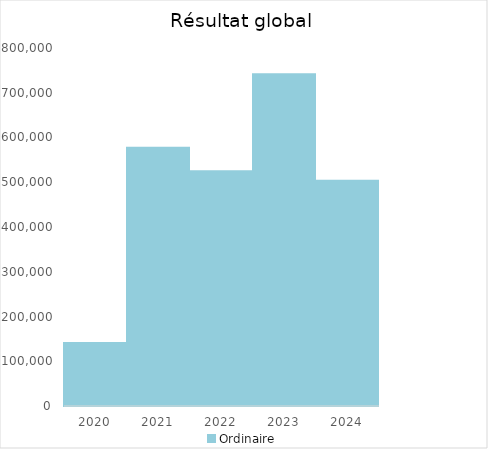
| Category |   | Ordinaire |    |
|---|---|---|---|
| 2020.0 |  | 140896.09 |  |
| 2021.0 |  | 576928.96 |  |
| 2022.0 |  | 524660.07 |  |
| 2023.0 |  | 741115.54 |  |
| 2024.0 |  | 503336.36 |  |